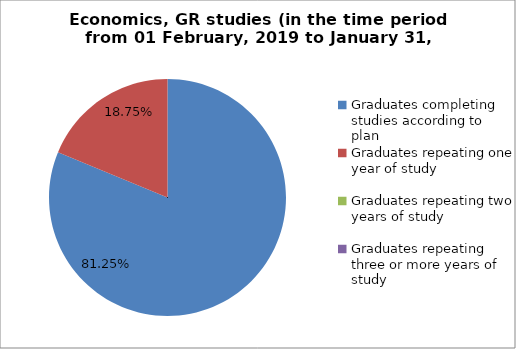
| Category | Series 0 |
|---|---|
| Graduates completing studies according to plan | 81.25 |
| Graduates repeating one year of study | 18.75 |
| Graduates repeating two years of study | 0 |
| Graduates repeating three or more years of study | 0 |